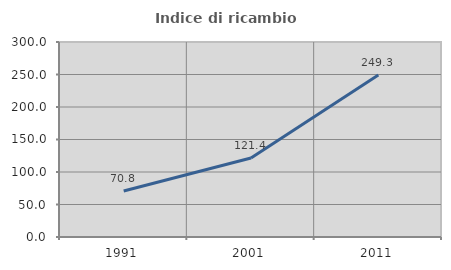
| Category | Indice di ricambio occupazionale  |
|---|---|
| 1991.0 | 70.822 |
| 2001.0 | 121.448 |
| 2011.0 | 249.315 |